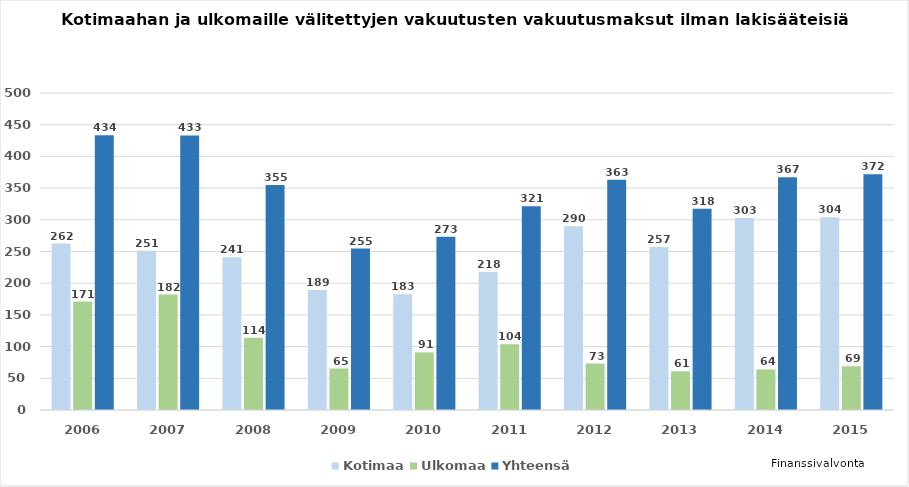
| Category | Kotimaa | Ulkomaa | Yhteensä  |
|---|---|---|---|
| 2006.0 | 262.471 | 171.056 | 433.526 |
| 2007.0 | 251 | 182 | 433 |
| 2008.0 | 241 | 114 | 355 |
| 2009.0 | 189.249 | 65.417 | 254.666 |
| 2010.0 | 182.562 | 90.729 | 273.291 |
| 2011.0 | 217.55 | 103.894 | 321.444 |
| 2012.0 | 289.922 | 73.321 | 363.243 |
| 2013.0 | 257 | 61 | 317.523 |
| 2014.0 | 303 | 64 | 367 |
| 2015.0 | 304 | 69 | 372 |